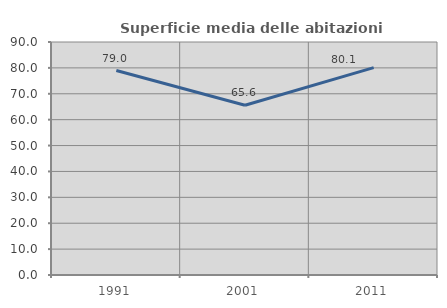
| Category | Superficie media delle abitazioni occupate |
|---|---|
| 1991.0 | 78.977 |
| 2001.0 | 65.558 |
| 2011.0 | 80.091 |